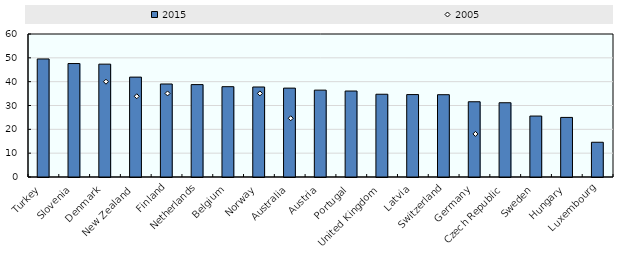
| Category | 2015 |
|---|---|
| Turkey | 49.525 |
| Slovenia | 47.607 |
| Denmark | 47.352 |
| New Zealand | 41.908 |
| Finland | 39.022 |
| Netherlands | 38.766 |
| Belgium | 37.898 |
| Norway | 37.764 |
| Australia | 37.295 |
| Austria | 36.446 |
| Portugal | 36.077 |
| United Kingdom | 34.724 |
| Latvia | 34.586 |
| Switzerland | 34.53 |
| Germany | 31.572 |
| Czech Republic | 31.158 |
| Sweden | 25.571 |
| Hungary | 24.999 |
| Luxembourg | 14.58 |